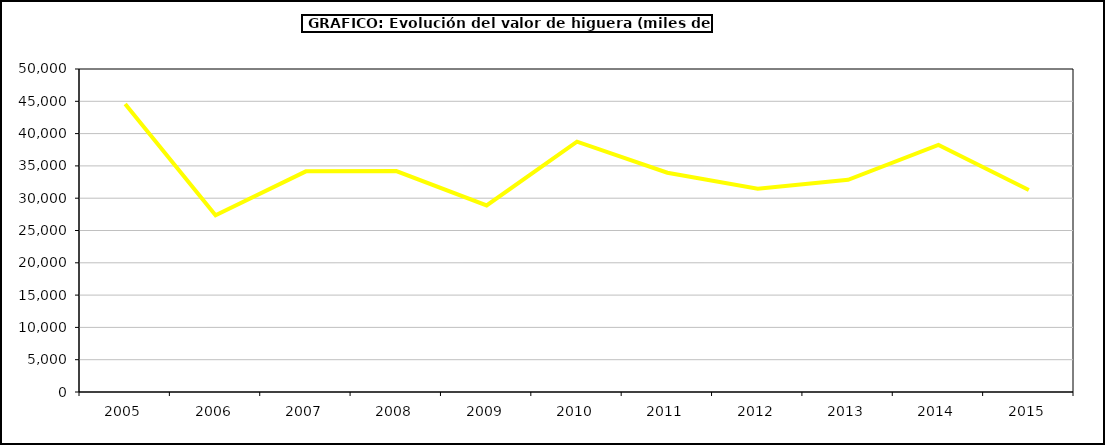
| Category | valor higuera |
|---|---|
| 2005.0 | 44570.526 |
| 2006.0 | 27367.47 |
| 2007.0 | 34159.652 |
| 2008.0 | 34191.335 |
| 2009.0 | 28875.392 |
| 2010.0 | 38741.248 |
| 2011.0 | 33937.485 |
| 2012.0 | 31478.992 |
| 2013.0 | 32844.373 |
| 2014.0 | 38257.221 |
| 2015.0 | 31266 |